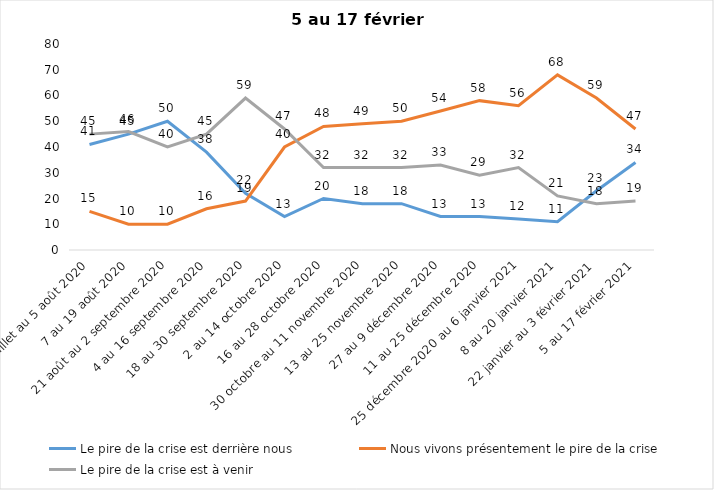
| Category | Le pire de la crise est derrière nous | Nous vivons présentement le pire de la crise | Le pire de la crise est à venir |
|---|---|---|---|
| 24 juillet au 5 août 2020 | 41 | 15 | 45 |
| 7 au 19 août 2020 | 45 | 10 | 46 |
| 21 août au 2 septembre 2020 | 50 | 10 | 40 |
| 4 au 16 septembre 2020 | 38 | 16 | 45 |
| 18 au 30 septembre 2020 | 22 | 19 | 59 |
| 2 au 14 octobre 2020 | 13 | 40 | 47 |
| 16 au 28 octobre 2020 | 20 | 48 | 32 |
| 30 octobre au 11 novembre 2020 | 18 | 49 | 32 |
| 13 au 25 novembre 2020 | 18 | 50 | 32 |
| 27 au 9 décembre 2020 | 13 | 54 | 33 |
| 11 au 25 décembre 2020 | 13 | 58 | 29 |
| 25 décembre 2020 au 6 janvier 2021 | 12 | 56 | 32 |
| 8 au 20 janvier 2021 | 11 | 68 | 21 |
| 22 janvier au 3 février 2021 | 23 | 59 | 18 |
| 5 au 17 février 2021 | 34 | 47 | 19 |